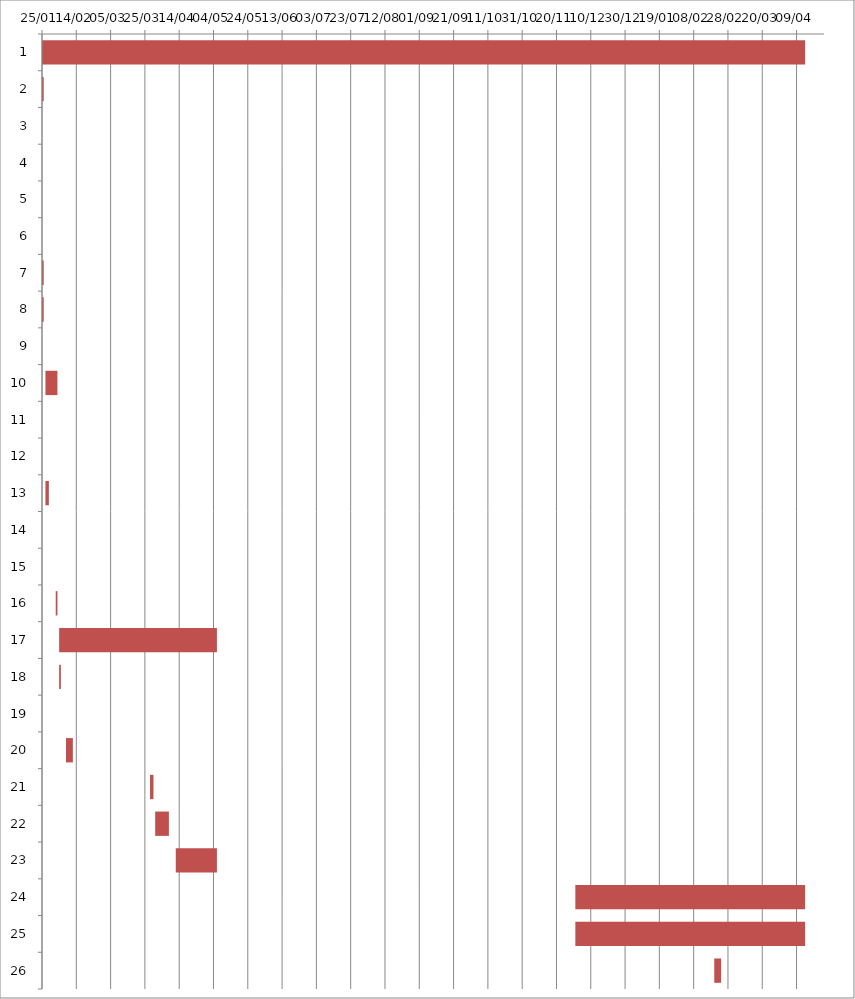
| Category | Fecha de inicio | DURACIÓN |
|---|---|---|
| 0 | 1/25/16 | 445 |
| 1 | 1/25/16 | 1 |
| 2 | 1/25/16 | 0 |
| 3 | 1/25/16 | 0 |
| 4 | 1/25/16 | 0 |
| 5 | 1/25/16 | 0 |
| 6 | 1/25/16 | 1 |
| 7 | 1/25/16 | 1 |
| 8 | 1/26/16 | 0 |
| 9 | 1/27/16 | 7 |
| 10 | 1/27/16 | 0 |
| 11 | 1/28/16 | 0 |
| 12 | 1/27/16 | 2 |
| 13 | 2/1/16 | 0 |
| 14 | 2/2/16 | 0 |
| 15 | 2/2/16 | 1 |
| 16 | 2/4/16 | 92 |
| 17 | 2/4/16 | 1 |
| 18 | 2/5/16 | 0 |
| 19 | 2/8/16 | 4 |
| 20 | 3/28/16 | 2 |
| 21 | 3/31/16 | 8 |
| 22 | 4/12/16 | 24 |
| 23 | 12/1/16 | 134 |
| 24 | 12/1/16 | 134 |
| 25 | 2/20/17 | 4 |